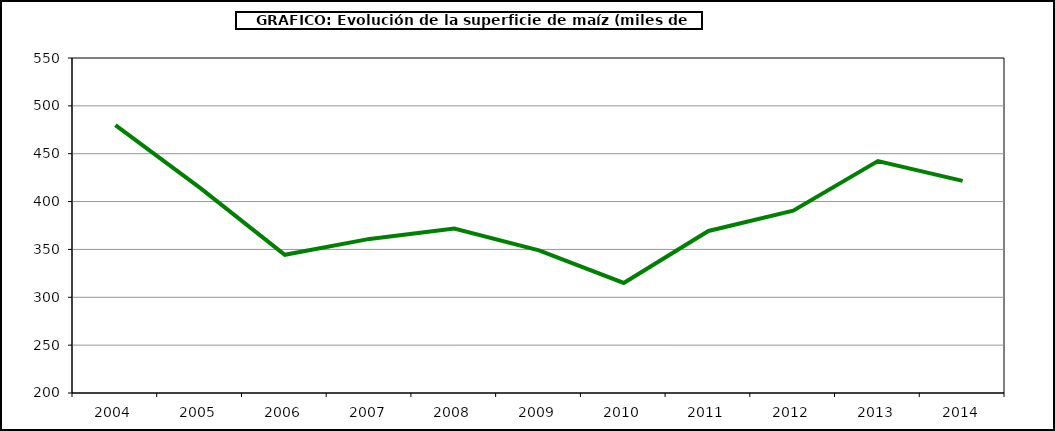
| Category | Superficie |
|---|---|
| 2004.0 | 479.801 |
| 2005.0 | 414.298 |
| 2006.0 | 344.4 |
| 2007.0 | 360.998 |
| 2008.0 | 371.732 |
| 2009.0 | 348.949 |
| 2010.0 | 314.99 |
| 2011.0 | 369.264 |
| 2012.0 | 390.433 |
| 2013.0 | 442.298 |
| 2014.0 | 421.605 |